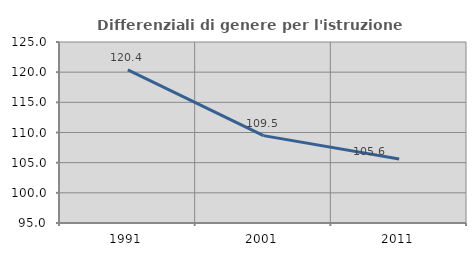
| Category | Differenziali di genere per l'istruzione superiore |
|---|---|
| 1991.0 | 120.377 |
| 2001.0 | 109.484 |
| 2011.0 | 105.61 |